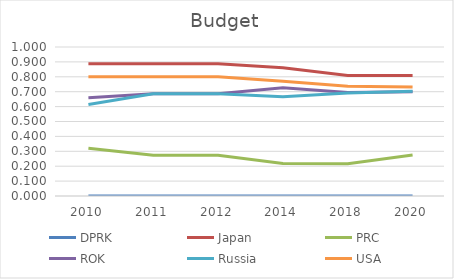
| Category | DPRK  | Japan  | PRC  | ROK  | Russia  | USA  |
|---|---|---|---|---|---|---|
| 2010.0 | 0 | 0.887 | 0.32 | 0.66 | 0.613 | 0.8 |
| 2011.0 | 0 | 0.887 | 0.273 | 0.687 | 0.687 | 0.8 |
| 2012.0 | 0 | 0.887 | 0.273 | 0.687 | 0.687 | 0.8 |
| 2014.0 | 0 | 0.861 | 0.217 | 0.727 | 0.667 | 0.771 |
| 2018.0 | 0 | 0.809 | 0.217 | 0.695 | 0.692 | 0.736 |
| 2020.0 | 0 | 0.809 | 0.276 | 0.7 | 0.703 | 0.731 |